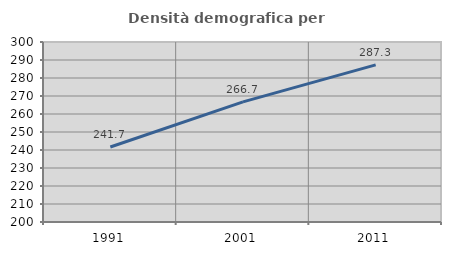
| Category | Densità demografica |
|---|---|
| 1991.0 | 241.665 |
| 2001.0 | 266.743 |
| 2011.0 | 287.308 |